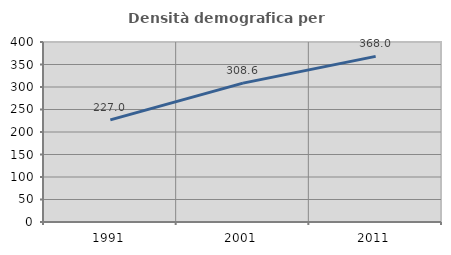
| Category | Densità demografica |
|---|---|
| 1991.0 | 226.969 |
| 2001.0 | 308.617 |
| 2011.0 | 367.991 |